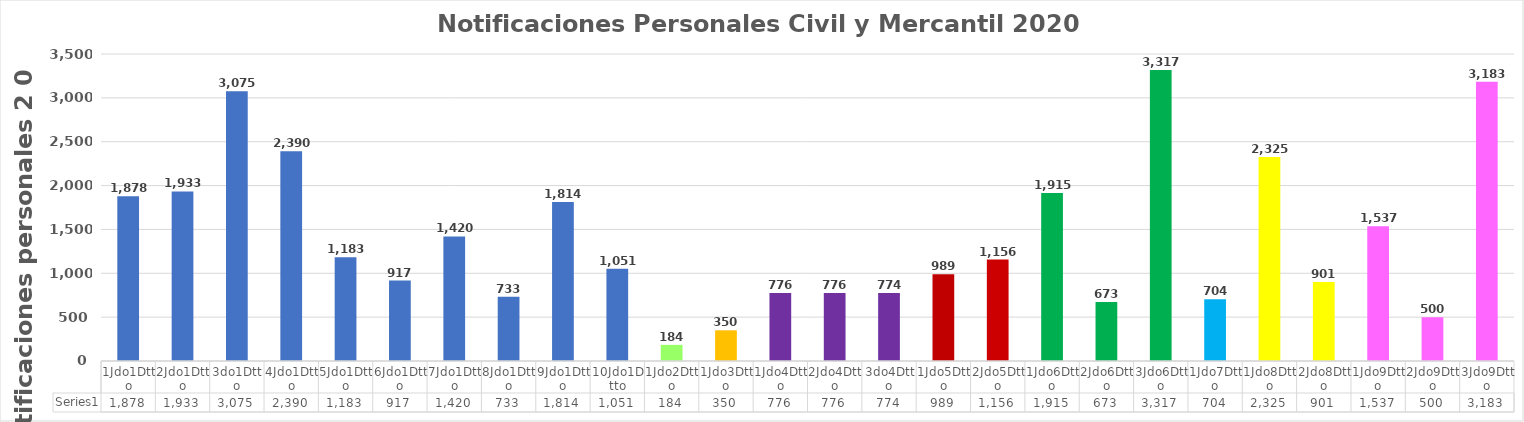
| Category | Series 0 |
|---|---|
| 1Jdo1Dtto | 1878 |
| 2Jdo1Dtto | 1933 |
| 3do1Dtto | 3075 |
| 4Jdo1Dtto | 2390 |
| 5Jdo1Dtto | 1183 |
| 6Jdo1Dtto | 917 |
| 7Jdo1Dtto | 1420 |
| 8Jdo1Dtto | 733 |
| 9Jdo1Dtto | 1814 |
| 10Jdo1Dtto | 1051 |
| 1Jdo2Dtto | 184 |
| 1Jdo3Dtto | 350 |
| 1Jdo4Dtto | 776 |
| 2Jdo4Dtto | 776 |
| 3do4Dtto | 774 |
| 1Jdo5Dtto | 989 |
| 2Jdo5Dtto | 1156 |
| 1Jdo6Dtto | 1915 |
| 2Jdo6Dtto | 673 |
| 3Jdo6Dtto | 3317 |
| 1Jdo7Dtto | 704 |
| 1Jdo8Dtto | 2325 |
| 2Jdo8Dtto | 901 |
| 1Jdo9Dtto | 1537 |
| 2Jdo9Dtto | 500 |
| 3Jdo9Dtto | 3183 |